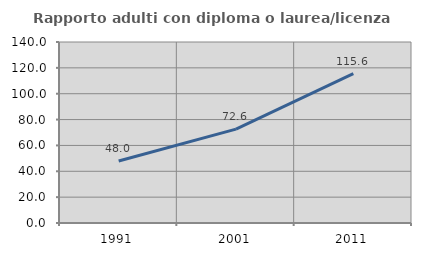
| Category | Rapporto adulti con diploma o laurea/licenza media  |
|---|---|
| 1991.0 | 47.98 |
| 2001.0 | 72.624 |
| 2011.0 | 115.613 |